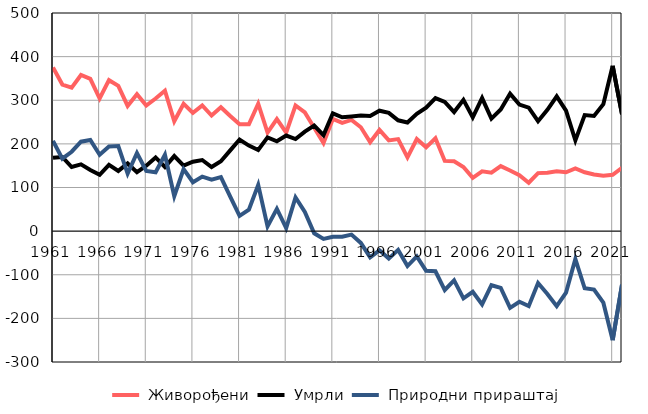
| Category |  Живорођени |  Умрли |  Природни прираштај |
|---|---|---|---|
| 1961.0 | 375 | 168 | 207 |
| 1962.0 | 336 | 170 | 166 |
| 1963.0 | 329 | 147 | 182 |
| 1964.0 | 358 | 153 | 205 |
| 1965.0 | 349 | 140 | 209 |
| 1966.0 | 304 | 129 | 175 |
| 1967.0 | 346 | 152 | 194 |
| 1968.0 | 333 | 138 | 195 |
| 1969.0 | 287 | 155 | 132 |
| 1970.0 | 314 | 135 | 179 |
| 1971.0 | 288 | 150 | 138 |
| 1972.0 | 304 | 169 | 135 |
| 1973.0 | 322 | 147 | 175 |
| 1974.0 | 252 | 172 | 80 |
| 1975.0 | 292 | 150 | 142 |
| 1976.0 | 271 | 159 | 112 |
| 1977.0 | 288 | 163 | 125 |
| 1978.0 | 265 | 147 | 118 |
| 1979.0 | 284 | 160 | 124 |
| 1980.0 | 264 | 185 | 79 |
| 1981.0 | 245 | 210 | 35 |
| 1982.0 | 245 | 196 | 49 |
| 1983.0 | 292 | 186 | 106 |
| 1984.0 | 226 | 215 | 11 |
| 1985.0 | 257 | 206 | 51 |
| 1986.0 | 226 | 219 | 7 |
| 1987.0 | 288 | 211 | 77 |
| 1988.0 | 272 | 228 | 44 |
| 1989.0 | 237 | 242 | -5 |
| 1990.0 | 202 | 220 | -18 |
| 1991.0 | 257 | 270 | -13 |
| 1992.0 | 248 | 261 | -13 |
| 1993.0 | 255 | 263 | -8 |
| 1994.0 | 238 | 265 | -27 |
| 1995.0 | 204 | 264 | -60 |
| 1996.0 | 232 | 276 | -44 |
| 1997.0 | 208 | 271 | -63 |
| 1998.0 | 211 | 254 | -43 |
| 1999.0 | 169 | 249 | -80 |
| 2000.0 | 211 | 269 | -58 |
| 2001.0 | 192 | 283 | -91 |
| 2002.0 | 213 | 305 | -92 |
| 2003.0 | 161 | 296 | -135 |
| 2004.0 | 160 | 273 | -113 |
| 2005.0 | 147 | 301 | -154 |
| 2006.0 | 122 | 261 | -139 |
| 2007.0 | 137 | 305 | -168 |
| 2008.0 | 134 | 258 | -124 |
| 2009.0 | 149 | 279 | -130 |
| 2010.0 | 139 | 315 | -176 |
| 2011.0 | 128 | 290 | -162 |
| 2012.0 | 111 | 283 | -172 |
| 2013.0 | 133 | 252 | -119 |
| 2014.0 | 134 | 278 | -144 |
| 2015.0 | 137 | 309 | -172 |
| 2016.0 | 135 | 276 | -141 |
| 2017.0 | 144 | 208 | -64 |
| 2018.0 | 135 | 266 | -131 |
| 2019.0 | 130 | 264 | -134 |
| 2020.0 | 127 | 291 | -164 |
| 2021.0 | 129 | 379 | -250 |
| 2022.0 | 145 | 268 | -123 |